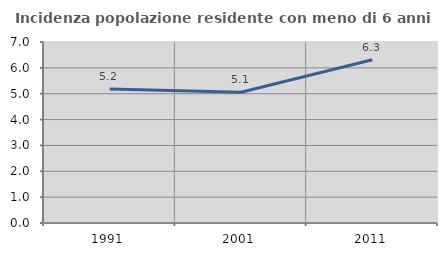
| Category | Incidenza popolazione residente con meno di 6 anni |
|---|---|
| 1991.0 | 5.183 |
| 2001.0 | 5.056 |
| 2011.0 | 6.313 |